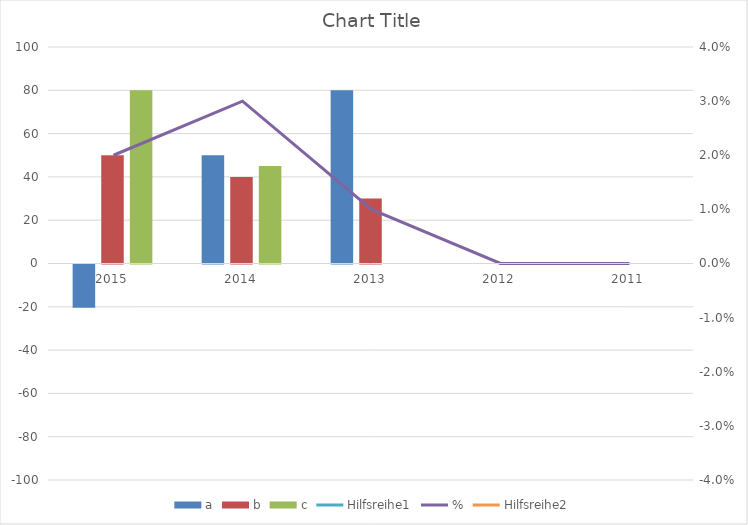
| Category | a | b | c |
|---|---|---|---|
| 2015.0 | -20 | 50 | 80 |
| 2014.0 | 50 | 40 | 45 |
| 2013.0 | 80 | 30 | 0 |
| 2012.0 | 0 | 0 | 0 |
| 2011.0 | 0 | 0 | 0 |